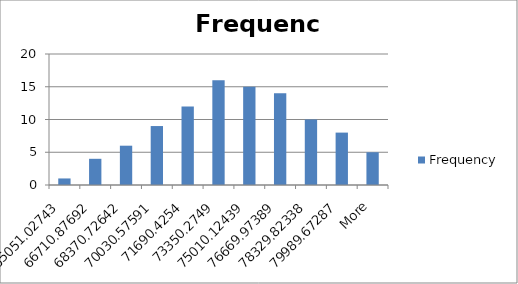
| Category | Frequency |
|---|---|
| 65051.02743 | 1 |
| 66710.87692 | 4 |
| 68370.72642 | 6 |
| 70030.57591 | 9 |
| 71690.4254 | 12 |
| 73350.2749 | 16 |
| 75010.12439 | 15 |
| 76669.97389 | 14 |
| 78329.82338 | 10 |
| 79989.67287 | 8 |
| More | 5 |